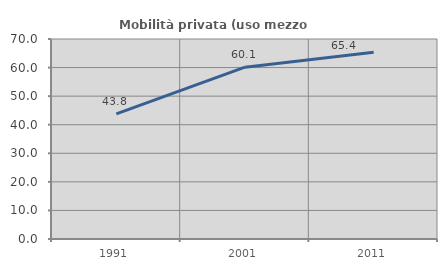
| Category | Mobilità privata (uso mezzo privato) |
|---|---|
| 1991.0 | 43.787 |
| 2001.0 | 60.128 |
| 2011.0 | 65.369 |